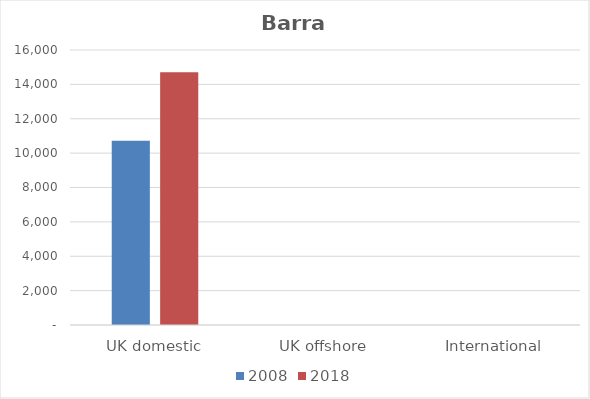
| Category | 2008 | 2018 |
|---|---|---|
| UK domestic | 10722 | 14706 |
| UK offshore | 0 | 0 |
| International | 0 | 0 |